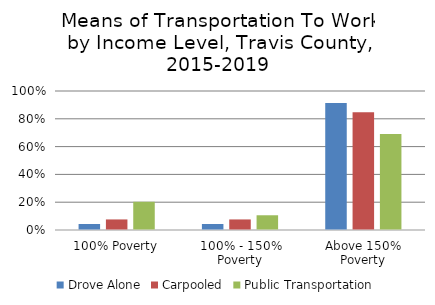
| Category | Drove Alone | Carpooled | Public Transportation |
|---|---|---|---|
| 100% Poverty | 0.043 | 0.076 | 0.203 |
| 100% - 150% Poverty | 0.043 | 0.076 | 0.106 |
| Above 150% Poverty | 0.914 | 0.848 | 0.69 |